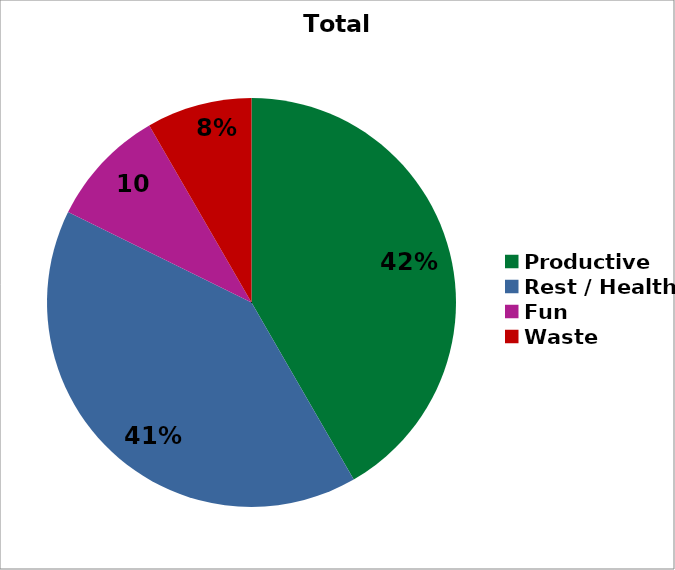
| Category | Series 0 |
|---|---|
| Productive | 12.444 |
| Rest / Health | 12.133 |
| Fun | 2.8 |
| Waste | 2.489 |